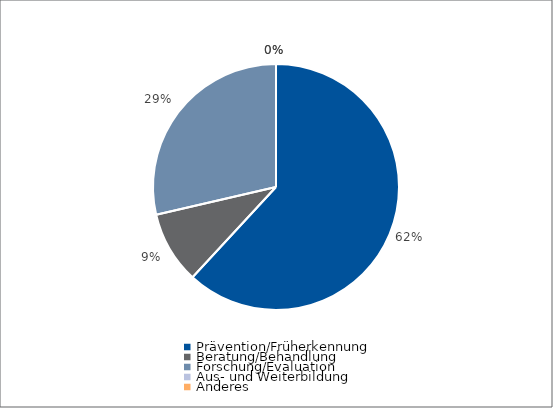
| Category | Series 0 |
|---|---|
| Prävention/Früherkennung | 9771 |
| Beratung/Behandlung | 1500 |
| Forschung/Evaluation | 4520 |
| Aus- und Weiterbildung | 0 |
| Anderes | 0 |